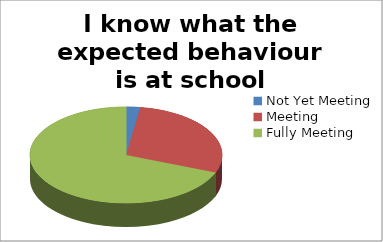
| Category | I know what the expected behaviour is at school |
|---|---|
| Not Yet Meeting | 2 |
| Meeting | 24 |
| Fully Meeting | 58 |